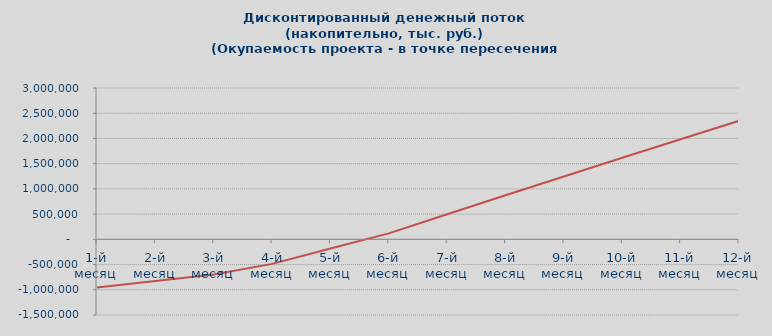
| Category | Дисконтированный поток денежных средств, накопительно |
|---|---|
| 1-й месяц | -954300 |
| 2-й месяц | -825011.205 |
| 3-й месяц | -696725.768 |
| 4-й месяц | -486790.294 |
| 5-й месяц | -183490.964 |
| 6-й месяц | 117454.583 |
| 7-й месяц | 496800.979 |
| 8-й месяц | 873203.423 |
| 9-й месяц | 1246684.761 |
| 10-й месяц | 1617267.663 |
| 11-й месяц | 1984974.622 |
| 12-й месяц | 2349827.958 |